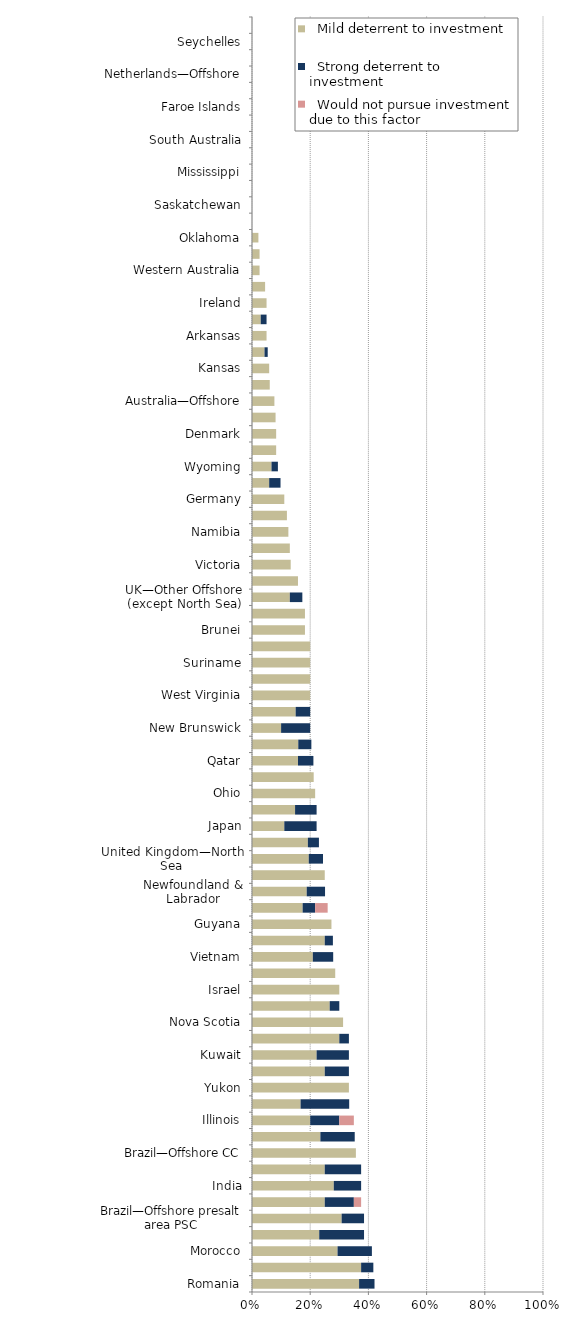
| Category |   Mild deterrent to investment |   Strong deterrent to investment |   Would not pursue investment due to this factor |
|---|---|---|---|
| Romania | 0.368 | 0.053 | 0 |
| Philippines | 0.375 | 0.042 | 0 |
| Morocco | 0.294 | 0.118 | 0 |
| US Offshore—Alaska | 0.231 | 0.154 | 0 |
| Brazil—Offshore presalt area PSC | 0.308 | 0.077 | 0 |
| US Offshore—Gulf of Mexico | 0.25 | 0.1 | 0.025 |
| India | 0.281 | 0.094 | 0 |
| Mozambique | 0.25 | 0.125 | 0 |
| Brazil—Offshore CC | 0.357 | 0 | 0 |
| New South Wales | 0.235 | 0.118 | 0 |
| Illinois | 0.2 | 0.1 | 0.05 |
| Greenland | 0.167 | 0.167 | 0 |
| Yukon | 0.333 | 0 | 0 |
| Poland | 0.25 | 0.083 | 0 |
| Kuwait | 0.222 | 0.111 | 0 |
| Peru | 0.3 | 0.033 | 0 |
| Nova Scotia | 0.313 | 0 | 0 |
| Pennsylvania | 0.267 | 0.033 | 0 |
| Israel | 0.3 | 0 | 0 |
| Northwest Territories | 0.286 | 0 | 0 |
| Vietnam | 0.209 | 0.07 | 0 |
| Malaysia | 0.25 | 0.028 | 0 |
| Guyana | 0.273 | 0 | 0 |
| Michigan | 0.174 | 0.043 | 0.043 |
| Newfoundland & Labrador | 0.188 | 0.063 | 0 |
| Malta | 0.25 | 0 | 0 |
| United Kingdom—North Sea | 0.195 | 0.049 | 0 |
| British Columbia | 0.192 | 0.038 | 0 |
| Japan | 0.111 | 0.111 | 0 |
| Ghana | 0.148 | 0.074 | 0 |
| Ohio | 0.217 | 0 | 0 |
| Montana | 0.212 | 0 | 0 |
| Qatar | 0.158 | 0.053 | 0 |
| Colombia | 0.159 | 0.045 | 0 |
| New Brunswick | 0.1 | 0.1 | 0 |
| New Mexico | 0.15 | 0.05 | 0 |
| West Virginia | 0.2 | 0 | 0 |
| French Guiana | 0.2 | 0 | 0 |
| Suriname | 0.2 | 0 | 0 |
| Uruguay | 0.2 | 0 | 0 |
| Brunei | 0.182 | 0 | 0 |
| United Arab Emirates | 0.182 | 0 | 0 |
| UK—Other Offshore (except North Sea) | 0.13 | 0.043 | 0 |
| Alaska | 0.158 | 0 | 0 |
| Victoria | 0.133 | 0 | 0 |
| Trinidad and Tobago | 0.13 | 0 | 0 |
| Namibia | 0.125 | 0 | 0 |
| Queensland | 0.12 | 0 | 0 |
| Germany | 0.111 | 0 | 0 |
| Louisiana | 0.059 | 0.039 | 0 |
| Wyoming | 0.067 | 0.022 | 0 |
| Utah | 0.083 | 0 | 0 |
| Denmark | 0.083 | 0 | 0 |
| New Zealand | 0.081 | 0 | 0 |
| Australia—Offshore | 0.077 | 0 | 0 |
| North Dakota | 0.061 | 0 | 0 |
| Kansas | 0.059 | 0 | 0 |
| Alberta | 0.043 | 0.011 | 0 |
| Arkansas | 0.05 | 0 | 0 |
| Texas | 0.03 | 0.02 | 0 |
| Ireland | 0.05 | 0 | 0 |
| Oman | 0.045 | 0 | 0 |
| Western Australia | 0.026 | 0 | 0 |
| Norway—North Sea | 0.026 | 0 | 0 |
| Oklahoma | 0.022 | 0 | 0 |
| Manitoba | 0 | 0 | 0 |
| Saskatchewan | 0 | 0 | 0 |
| Alabama | 0 | 0 | 0 |
| Mississippi | 0 | 0 | 0 |
| Northern Territory | 0 | 0 | 0 |
| South Australia | 0 | 0 | 0 |
| Tasmania | 0 | 0 | 0 |
| Faroe Islands | 0 | 0 | 0 |
| Netherlands—Onshore | 0 | 0 | 0 |
| Netherlands—Offshore | 0 | 0 | 0 |
| Norway—Other Offshore (except North Sea) | 0 | 0 | 0 |
| Seychelles | 0 | 0 | 0 |
| Chile | 0 | 0 | 0 |